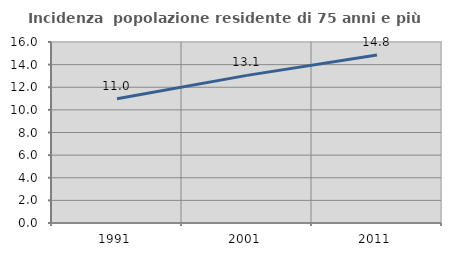
| Category | Incidenza  popolazione residente di 75 anni e più |
|---|---|
| 1991.0 | 10.981 |
| 2001.0 | 13.05 |
| 2011.0 | 14.848 |